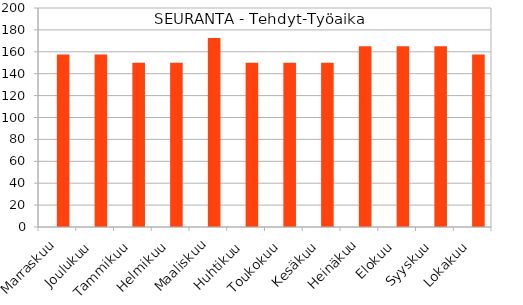
| Category | Series 0 | Series 1 |
|---|---|---|
| Marraskuu | 0 | 157.5 |
| Joulukuu | 0 | 157.5 |
| Tammikuu | 0 | 150 |
| Helmikuu | 0 | 150 |
| Maaliskuu | 0 | 172.5 |
| Huhtikuu | 0 | 150 |
| Toukokuu | 0 | 150 |
| Kesäkuu | 0 | 150 |
| Heinäkuu | 0 | 165 |
| Elokuu | 0 | 165 |
| Syyskuu | 0 | 165 |
| Lokakuu | 0 | 157.5 |